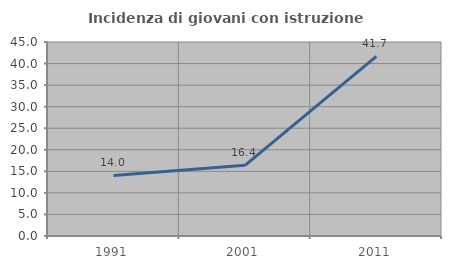
| Category | Incidenza di giovani con istruzione universitaria |
|---|---|
| 1991.0 | 14.035 |
| 2001.0 | 16.393 |
| 2011.0 | 41.667 |